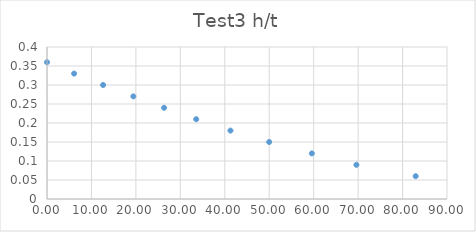
| Category | Series 0 |
|---|---|
| 0.0 | 0.36 |
| 6.1 | 0.33 |
| 12.62 | 0.3 |
| 19.43 | 0.27 |
| 26.34 | 0.24 |
| 33.57 | 0.21 |
| 41.28 | 0.18 |
| 49.99 | 0.15 |
| 59.59 | 0.12 |
| 69.62 | 0.09 |
| 82.95 | 0.06 |